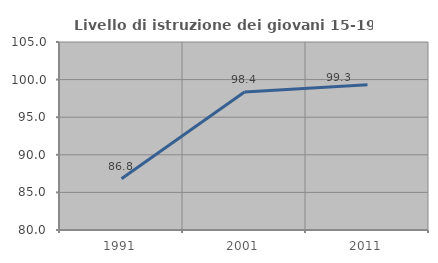
| Category | Livello di istruzione dei giovani 15-19 anni |
|---|---|
| 1991.0 | 86.822 |
| 2001.0 | 98.361 |
| 2011.0 | 99.329 |